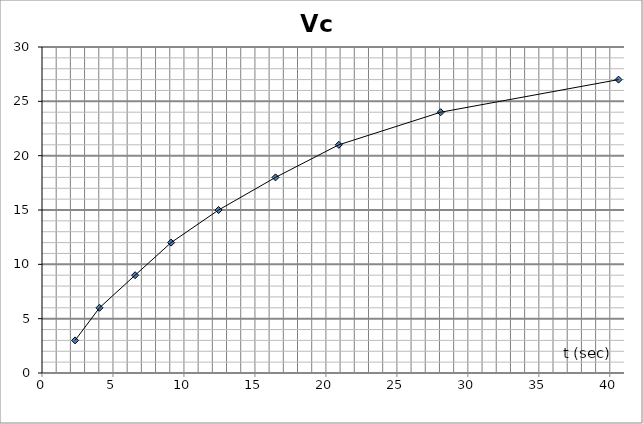
| Category | Vc (V) |
|---|---|
| 2.33 | 3 |
| 4.050000000000001 | 6 |
| 6.5600000000000005 | 9 |
| 9.094999999999999 | 12 |
| 12.440000000000001 | 15 |
| 16.45 | 18 |
| 20.909999999999997 | 21 |
| 28.09 | 24 |
| 40.614999999999995 | 27 |